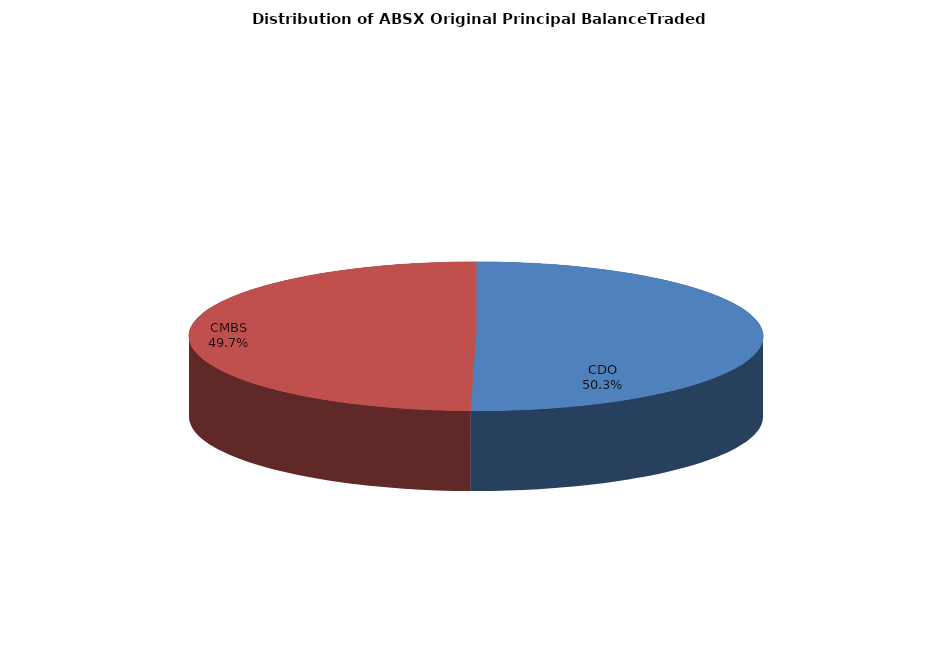
| Category | Series 0 |
|---|---|
| CDO | 1515036289.829 |
| CMBS | 1497408217.308 |